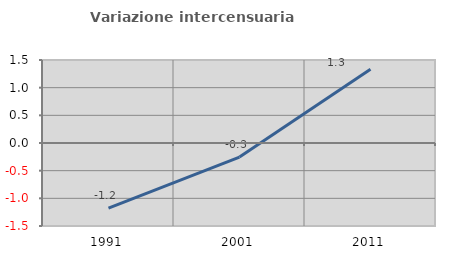
| Category | Variazione intercensuaria annua |
|---|---|
| 1991.0 | -1.176 |
| 2001.0 | -0.254 |
| 2011.0 | 1.334 |